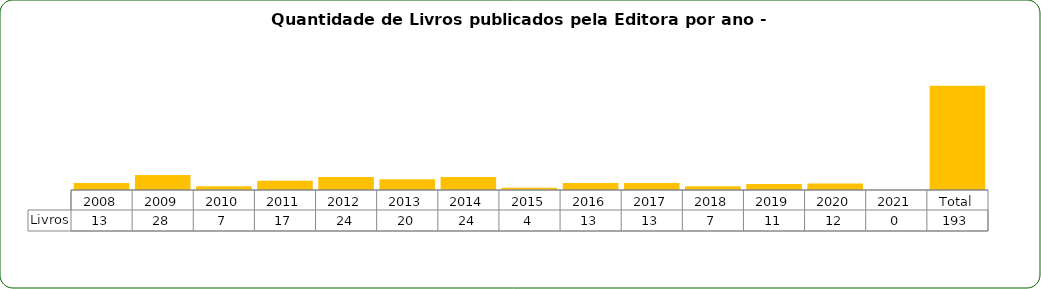
| Category | Livros |
|---|---|
| 2008 | 13 |
| 2009 | 28 |
| 2010 | 7 |
| 2011 | 17 |
| 2012 | 24 |
| 2013 | 20 |
| 2014 | 24 |
| 2015 | 4 |
| 2016 | 13 |
| 2017 | 13 |
| 2018 | 7 |
| 2019 | 11 |
| 2020 | 12 |
| 2021 | 0 |
| Total | 193 |